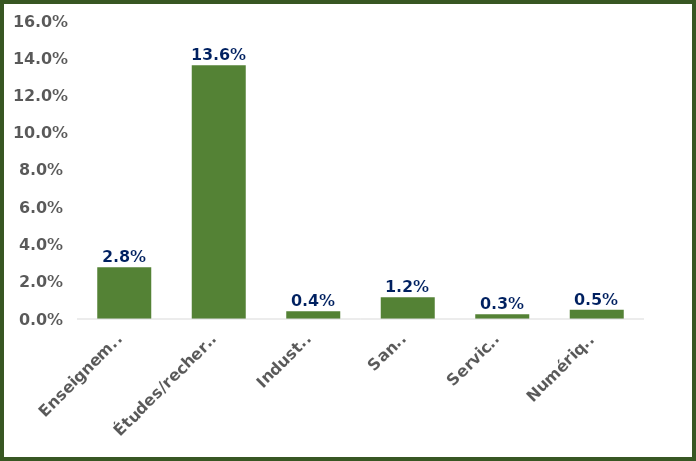
| Category | Ratio PhD par Grands Secteurs |
|---|---|
| Enseignement | 0.028 |
| Études/recherche | 0.136 |
| Industrie | 0.004 |
| Santé | 0.012 |
| Services | 0.003 |
| Numérique | 0.005 |